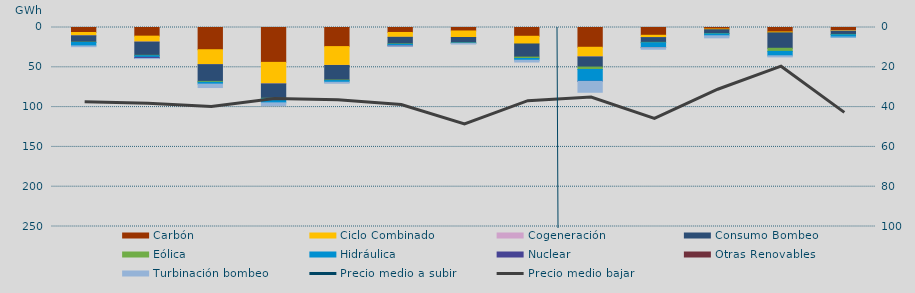
| Category | Carbón | Ciclo Combinado | Cogeneración | Consumo Bombeo | Eólica | Hidráulica | Nuclear | Otras Renovables | Turbinación bombeo |
|---|---|---|---|---|---|---|---|---|---|
| 0 | 6283.8 | 4145.3 | 18.9 | 7977.8 | 313 | 4389.8 | 0 | 0 | 935.6 |
| 1 | 10864.5 | 7378.2 | 88.1 | 16621.4 | 464.4 | 2067.3 | 1381.8 | 0 | 160.4 |
| 2 | 27924.7 | 18737.8 | 26.5 | 21039.7 | 1083.3 | 2318.1 | 0 | 0 | 4314 |
| 3 | 43819.1 | 26947.4 | 131.4 | 18038.2 | 700.3 | 5037 | 0 | 0 | 3400 |
| 4 | 23995.8 | 23603.4 | 120.4 | 18312.9 | 630.7 | 2095.3 | 0 | 0 | 1288.4 |
| 5 | 6238.1 | 6107.2 | 11.4 | 8233.1 | 466.1 | 1774.5 | 300.5 | 0 | 185 |
| 6 | 4345.4 | 8205.3 | 0 | 6736.7 | 204.5 | 506 | 0 | 0 | 802.1 |
| 7 | 11031.5 | 9660.7 | 0 | 16502.5 | 1775.9 | 2151.2 | 0 | 0 | 2234.6 |
| 8 | 24843.5 | 12025 | 139.2 | 12696.1 | 3036.8 | 14862.1 | 109.8 | 0 | 13649 |
| 9 | 9788.3 | 2896.9 | 13 | 5978.6 | 470.2 | 6144.5 | 0 | 2 | 2006.5 |
| 10 | 1915.7 | 883.7 | 0 | 4789.3 | 395.2 | 2417.8 | 0 | 0 | 2598.3 |
| 11 | 5601.6 | 1130.8 | 0 | 19369.2 | 3910.4 | 5534.9 | 0 | 0 | 1362.4 |
| 12 | 3825.2 | 805.7 | 1 | 4108.2 | 441.1 | 2792 | 0 | 0 | 67.3 |